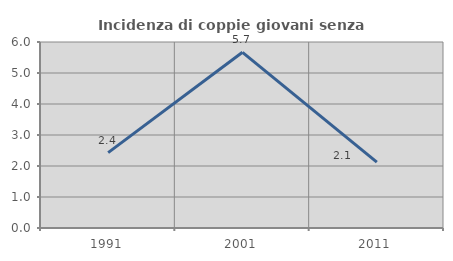
| Category | Incidenza di coppie giovani senza figli |
|---|---|
| 1991.0 | 2.43 |
| 2001.0 | 5.667 |
| 2011.0 | 2.124 |